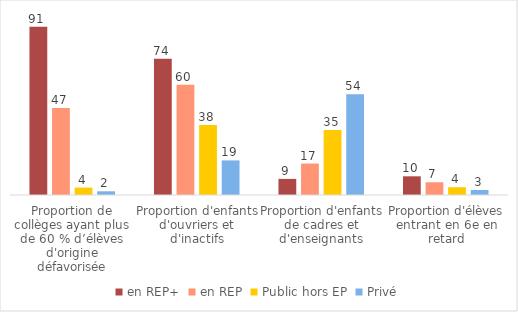
| Category | en REP+ | en REP | Public hors EP | Privé |
|---|---|---|---|---|
| Proportion de collèges ayant plus de 60 % d’élèves d'origine défavorisée | 91 | 47 | 4 | 2 |
| Proportion d'enfants d'ouvriers et d'inactifs | 73.7 | 59.6 | 37.9 | 18.7 |
| Proportion d'enfants de cadres et d'enseignants | 8.7 | 17 | 35.1 | 54.4 |
| Proportion d'élèves entrant en 6e en retard | 10.1 | 6.9 | 4.2 | 2.7 |